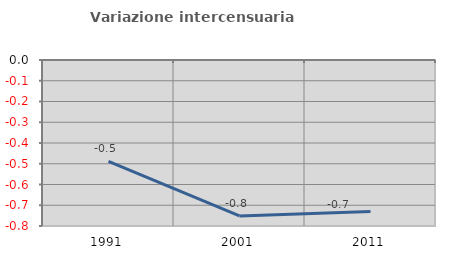
| Category | Variazione intercensuaria annua |
|---|---|
| 1991.0 | -0.489 |
| 2001.0 | -0.751 |
| 2011.0 | -0.731 |